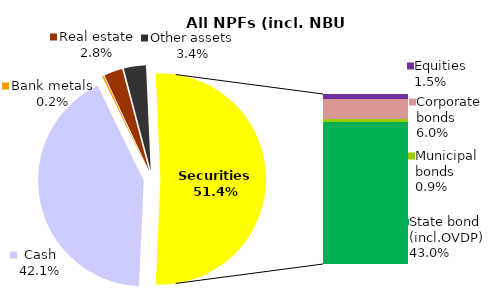
| Category | All NPF (incl. NBU CNPF)* |
|---|---|
| Cash | 1307.5 |
| Bank metals | 7.6 |
| Real estate | 88.5 |
| Other assets | 105.4 |
| Equities | 46.7 |
| Corporate bonds | 187.2 |
| Municipal bonds | 29.3 |
| State bond (incl.OVDP) | 1334.3 |